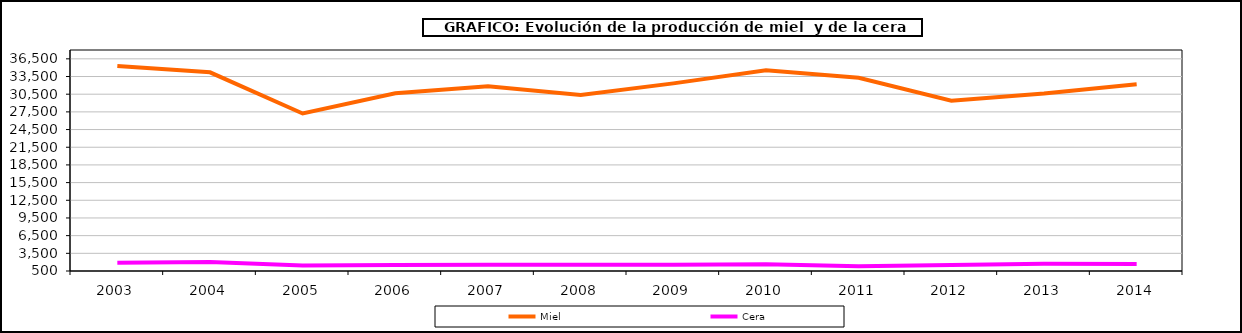
| Category | Miel | Cera |
|---|---|---|
| 2003.0 | 35278.604 | 1890.282 |
| 2004.0 | 34211.281 | 2012.912 |
| 2005.0 | 27229.804 | 1449.87 |
| 2006.0 | 30661.002 | 1522.368 |
| 2007.0 | 31840.043 | 1567.556 |
| 2008.0 | 30361.319 | 1574.535 |
| 2009.0 | 32336.448 | 1577.669 |
| 2010.0 | 34550 | 1649 |
| 2011.0 | 33298.2 | 1325.9 |
| 2012.0 | 29405 | 1533.9 |
| 2013.0 | 30612.761 | 1711.558 |
| 2014.0 | 32174.268 | 1688.302 |